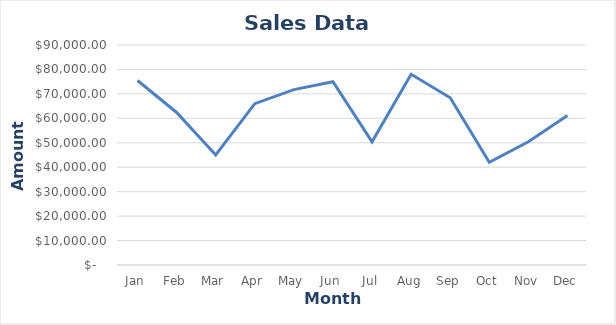
| Category | Monthly Earning |
|---|---|
| Jan | 75480 |
| Feb | 62400 |
| Mar | 45000 |
| Apr | 66000 |
| May | 71760 |
| Jun | 75000 |
| Jul | 50400 |
| Aug | 78000 |
| Sep | 68400 |
| Oct | 42000 |
| Nov | 50400 |
| Dec | 61200 |